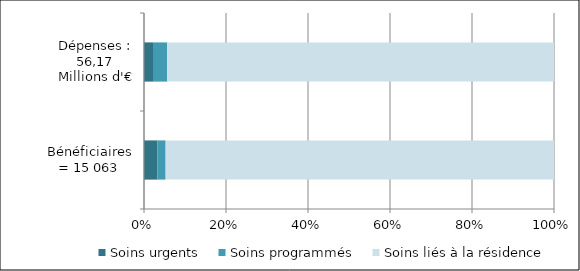
| Category | Soins urgents | Soins programmés | Soins liés à la résidence |
|---|---|---|---|
| Bénéficiaires = 15 063 | 490 | 305 | 14268 |
| Dépenses : 56,17 Millions d'€ | 1231541.39 | 1943808.83 | 52994425.296 |